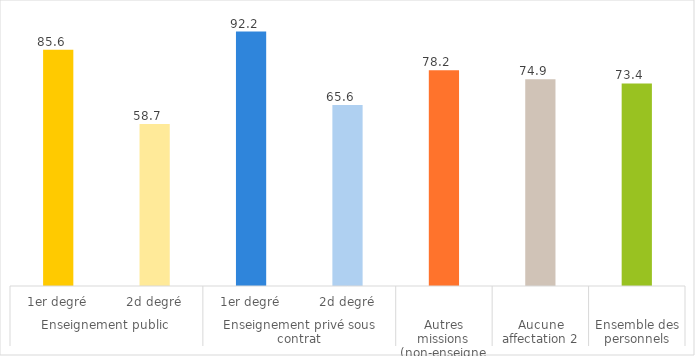
| Category | Part des femmes en % |
|---|---|
| 0 | 85.606 |
| 1 | 58.737 |
| 2 | 92.168 |
| 3 | 65.592 |
| 4 | 78.181 |
| 5 | 74.939 |
| 6 | 73.404 |